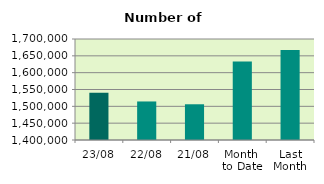
| Category | Series 0 |
|---|---|
| 23/08 | 1540340 |
| 22/08 | 1514464 |
| 21/08 | 1506138 |
| Month 
to Date | 1633078.471 |
| Last
Month | 1667155.619 |